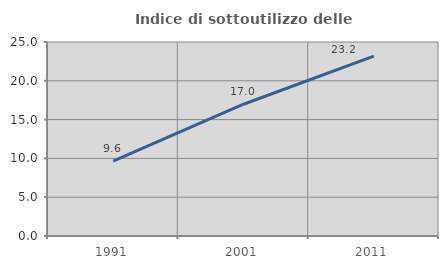
| Category | Indice di sottoutilizzo delle abitazioni  |
|---|---|
| 1991.0 | 9.647 |
| 2001.0 | 16.981 |
| 2011.0 | 23.188 |